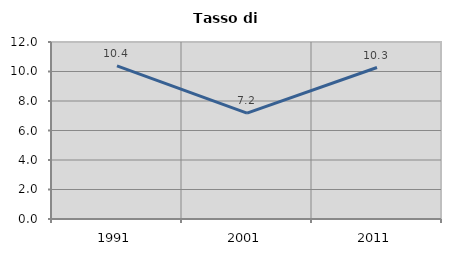
| Category | Tasso di disoccupazione   |
|---|---|
| 1991.0 | 10.377 |
| 2001.0 | 7.176 |
| 2011.0 | 10.27 |